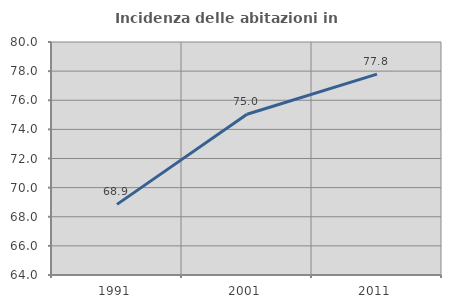
| Category | Incidenza delle abitazioni in proprietà  |
|---|---|
| 1991.0 | 68.851 |
| 2001.0 | 75.041 |
| 2011.0 | 77.796 |